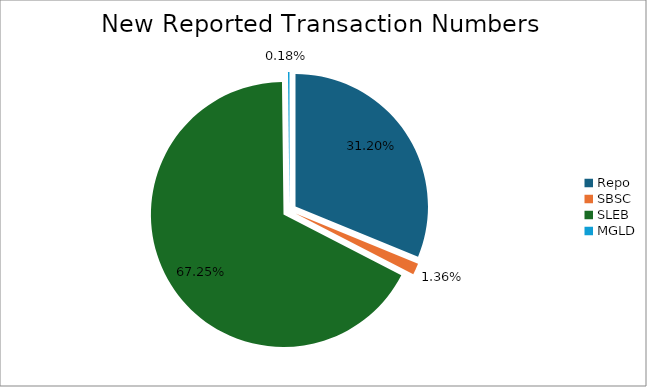
| Category | Series 0 |
|---|---|
| Repo | 465914 |
| SBSC | 20380 |
| SLEB | 1004050 |
| MGLD | 2751 |